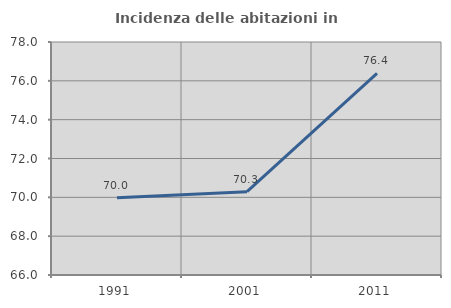
| Category | Incidenza delle abitazioni in proprietà  |
|---|---|
| 1991.0 | 69.978 |
| 2001.0 | 70.293 |
| 2011.0 | 76.388 |